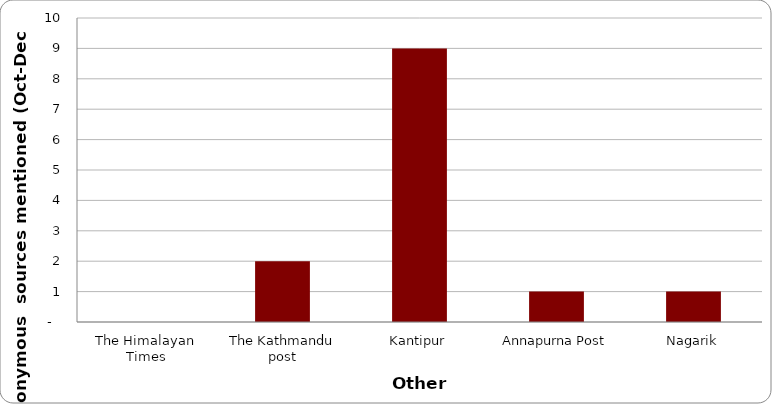
| Category | Others |
|---|---|
| The Himalayan Times | 0 |
| The Kathmandu post | 2 |
| Kantipur | 9 |
| Annapurna Post | 1 |
| Nagarik | 1 |